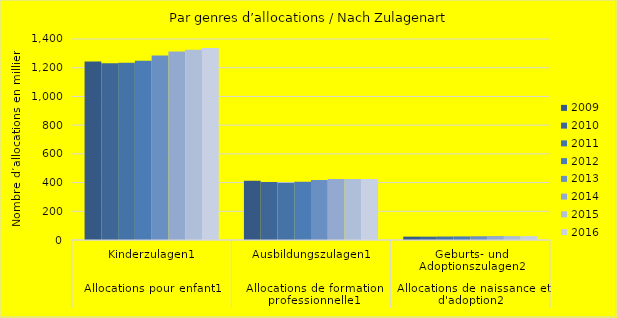
| Category | 2009 | 2010 | 2011 | 2012 | 2013 | 2014 | 2015 | 2016 |
|---|---|---|---|---|---|---|---|---|
| 0 | 1243.915 | 1231.254 | 1234.261 | 1248.082 | 1284.655 | 1313.136 | 1325.602 | 1337.61 |
| 1 | 413.37 | 403.288 | 398.424 | 406.169 | 418.206 | 424.16 | 424.807 | 424.258 |
| 2 | 23.357 | 23.33 | 24.187 | 25.015 | 26.005 | 27.474 | 27.115 | 27.083 |